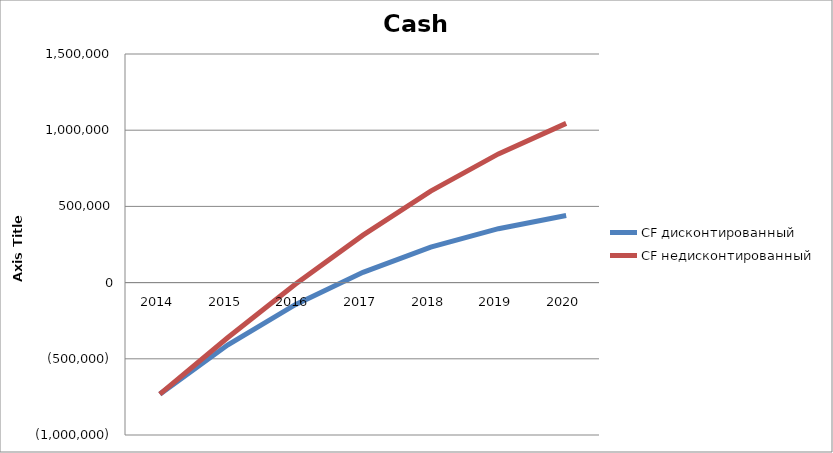
| Category | CF дисконтированный | CF недисконтированный |
|---|---|---|
| 2014.0 | -731683.288 | -731683.288 |
| 2015.0 | -410079.419 | -361838.839 |
| 2016.0 | -144507.161 | -10619.527 |
| 2017.0 | 67205.816 | 311369.446 |
| 2018.0 | 232333.288 | 600178.427 |
| 2019.0 | 353710.174 | 844310.699 |
| 2020.0 | 440362.88 | 1044743.674 |